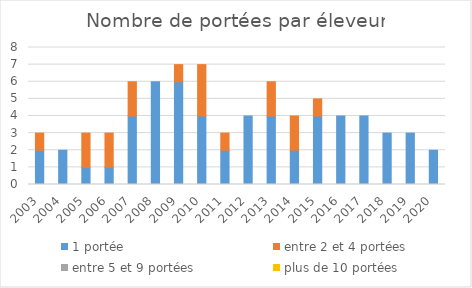
| Category | 1 portée | entre 2 et 4 portées | entre 5 et 9 portées | plus de 10 portées |
|---|---|---|---|---|
| 2003.0 | 2 | 1 | 0 | 0 |
| 2004.0 | 2 | 0 | 0 | 0 |
| 2005.0 | 1 | 2 | 0 | 0 |
| 2006.0 | 1 | 2 | 0 | 0 |
| 2007.0 | 4 | 2 | 0 | 0 |
| 2008.0 | 6 | 0 | 0 | 0 |
| 2009.0 | 6 | 1 | 0 | 0 |
| 2010.0 | 4 | 3 | 0 | 0 |
| 2011.0 | 2 | 1 | 0 | 0 |
| 2012.0 | 4 | 0 | 0 | 0 |
| 2013.0 | 4 | 2 | 0 | 0 |
| 2014.0 | 2 | 2 | 0 | 0 |
| 2015.0 | 4 | 1 | 0 | 0 |
| 2016.0 | 4 | 0 | 0 | 0 |
| 2017.0 | 4 | 0 | 0 | 0 |
| 2018.0 | 3 | 0 | 0 | 0 |
| 2019.0 | 3 | 0 | 0 | 0 |
| 2020.0 | 2 | 0 | 0 | 0 |